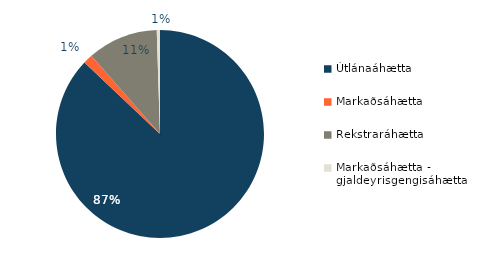
| Category | Series 0 |
|---|---|
| Útlánaáhætta | 0.871 |
| Markaðsáhætta | 0.015 |
| Rekstraráhætta | 0.11 |
| Markaðsáhætta - gjaldeyrisgengisáhætta | 0.005 |